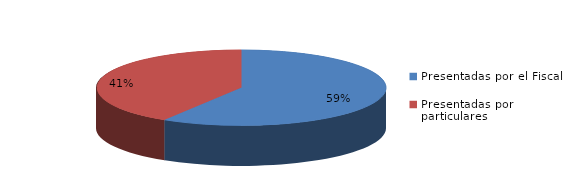
| Category | Series 0 |
|---|---|
| Presentadas por el Fiscal | 100 |
| Presentadas por particulares | 70 |